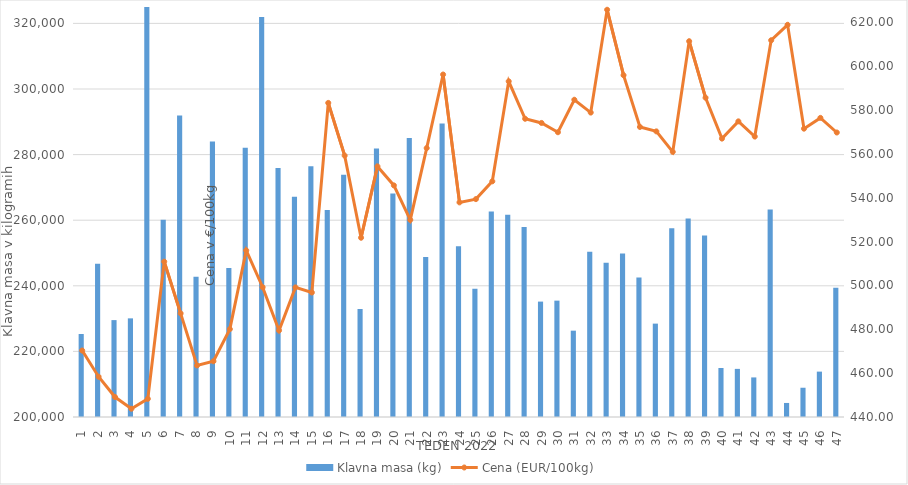
| Category | Klavna masa (kg) |
|---|---|
| 1.0 | 225300 |
| 2.0 | 246712 |
| 3.0 | 229541 |
| 4.0 | 230074 |
| 5.0 | 328640 |
| 6.0 | 260108 |
| 7.0 | 291887 |
| 8.0 | 242732 |
| 9.0 | 283987 |
| 10.0 | 245414 |
| 11.0 | 282092 |
| 12.0 | 321936 |
| 13.0 | 275950 |
| 14.0 | 267148 |
| 15.0 | 276417 |
| 16.0 | 263098 |
| 17.0 | 273824 |
| 18.0 | 232926 |
| 19.0 | 281859 |
| 20.0 | 268153 |
| 21.0 | 285073 |
| 22.0 | 248783 |
| 23.0 | 289478 |
| 24.0 | 252069 |
| 25.0 | 239099 |
| 26.0 | 262689 |
| 27.0 | 261656 |
| 28.0 | 257905 |
| 29.0 | 235185 |
| 30.0 | 235475 |
| 31.0 | 226322 |
| 32.0 | 250418 |
| 33.0 | 246996 |
| 34.0 | 249873 |
| 35.0 | 242516 |
| 36.0 | 228469 |
| 37.0 | 257511 |
| 38.0 | 260481 |
| 39.0 | 255370 |
| 40.0 | 214936 |
| 41.0 | 214672 |
| 42.0 | 212066 |
| 43.0 | 263287 |
| 44.0 | 204280 |
| 45.0 | 208920 |
| 46.0 | 213836 |
| 47.0 | 239417 |